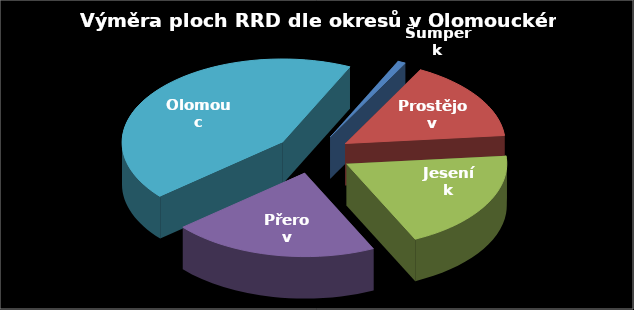
| Category | Výměra [ha] |
|---|---|
| Šumperk | 1.36 |
| Prostějov | 26.38 |
| Jeseník | 32.72 |
| Přerov | 34.96 |
| Olomouc | 72.48 |